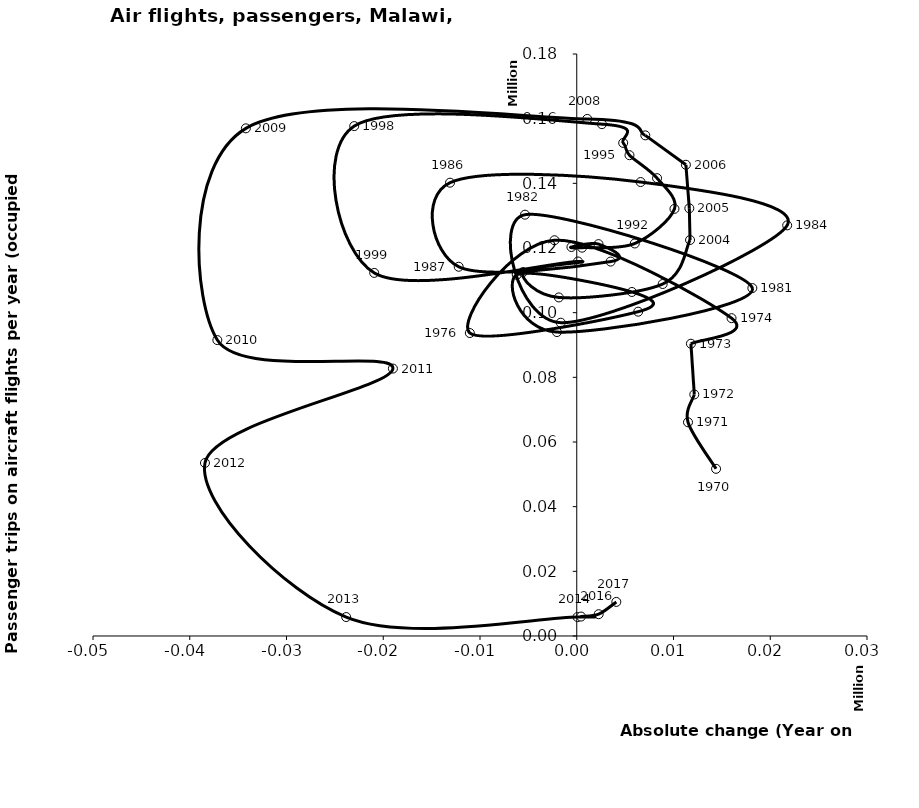
| Category | Series 0 |
|---|---|
| 14400.0 | 51700 |
| 11500.0 | 66100 |
| 12150.0 | 74700 |
| 11800.0 | 90400 |
| 16000.0 | 98300 |
| -2300.0 | 122400 |
| -11050.0 | 93700 |
| 6350.0 | 100300 |
| 5700.0 | 106400 |
| -6200.0 | 111700 |
| -2050.0 | 94000 |
| 18150.0 | 107600 |
| -5350.0 | 130300 |
| -1650.0 | 96900 |
| 21750.0 | 127000 |
| 6600.0 | 140400 |
| -13100.0 | 140200 |
| -12200.0 | 114200 |
| 3500.0 | 115800 |
| 2250.0 | 121200 |
| -550.0 | 120300 |
| 550.0 | 120100 |
| 6000.0 | 121400 |
| 10100.0 | 132100 |
| 8300.0 | 141600 |
| 5450.0 | 148700 |
| 4800.0 | 152500 |
| 2600.0 | 158300 |
| -23000.0 | 157700 |
| -20934.5 | 112300 |
| 130.0 | 115831 |
| -5560.0 | 112560 |
| -1853.0 | 104711 |
| 8883.0 | 108854 |
| 11710.5 | 122477 |
| 11635.0 | 132275 |
| 11281.0 | 145747 |
| 7085.0 | 154837 |
| 1085.0 | 159917 |
| -34198.40530230345 | 157007 |
| -37148.7275048821 | 91520.189 |
| -19000.595699177098 | 82709.545 |
| -38426.7724951179 | 53518.998 |
| -23831.49899851945 | 5856 |
| 77.5 | 5856 |
| 444.0 | 6011 |
| 2267.0 | 6744 |
| 4090.0 | 10545 |